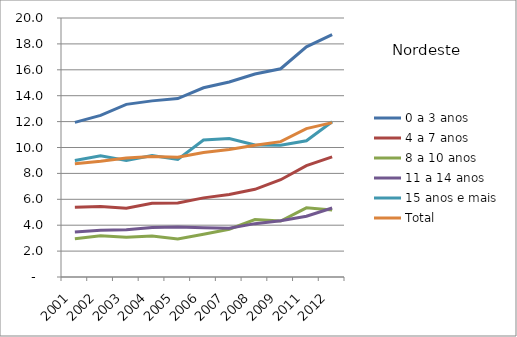
| Category | 0 a 3 anos | 4 a 7 anos | 8 a 10 anos | 11 a 14 anos | 15 anos e mais | Total |
|---|---|---|---|---|---|---|
| 2001 | 11.94 | 5.38 | 2.96 | 3.48 | 8.99 | 8.75 |
| 2002 | 12.48 | 5.44 | 3.18 | 3.61 | 9.37 | 8.93 |
| 2003 | 13.33 | 5.31 | 3.07 | 3.65 | 8.99 | 9.18 |
| 2004 | 13.6 | 5.7 | 3.17 | 3.83 | 9.38 | 9.3 |
| 2005 | 13.78 | 5.71 | 2.94 | 3.86 | 9.07 | 9.24 |
| 2006 | 14.61 | 6.11 | 3.3 | 3.81 | 10.58 | 9.62 |
| 2007 | 15.06 | 6.37 | 3.69 | 3.76 | 10.7 | 9.84 |
| 2008 | 15.68 | 6.77 | 4.44 | 4.12 | 10.2 | 10.17 |
| 2009 | 16.08 | 7.51 | 4.32 | 4.34 | 10.18 | 10.45 |
| 2011 | 17.77 | 8.6 | 5.34 | 4.69 | 10.52 | 11.46 |
| 2012 | 18.71 | 9.28 | 5.18 | 5.33 | 11.99 | 11.92 |